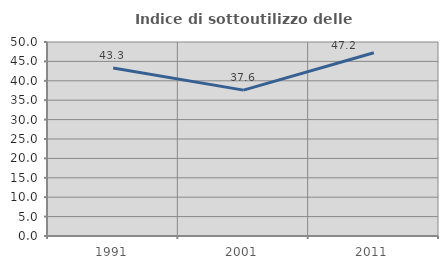
| Category | Indice di sottoutilizzo delle abitazioni  |
|---|---|
| 1991.0 | 43.297 |
| 2001.0 | 37.6 |
| 2011.0 | 47.222 |